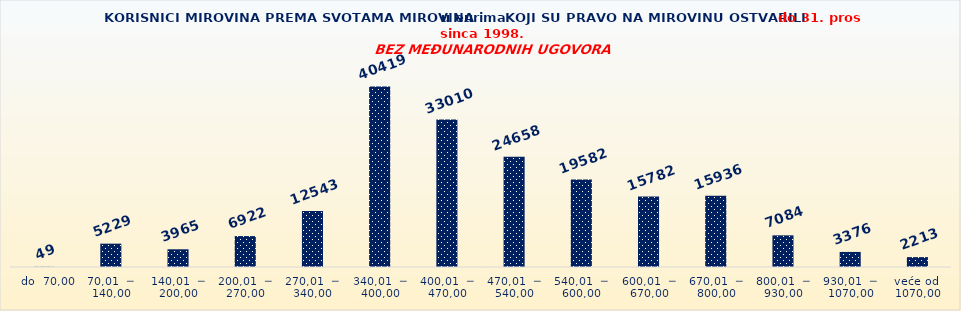
| Category | Series 0 |
|---|---|
|   do  70,00 | 49 |
| 70,01  ─  140,00 | 5229 |
| 140,01  ─  200,00 | 3965 |
| 200,01  ─  270,00 | 6922 |
| 270,01  ─  340,00 | 12543 |
| 340,01  ─  400,00 | 40419 |
| 400,01  ─  470,00 | 33010 |
| 470,01  ─  540,00 | 24658 |
| 540,01  ─  600,00 | 19582 |
| 600,01  ─  670,00 | 15782 |
| 670,01  ─  800,00 | 15936 |
| 800,01  ─  930,00 | 7084 |
| 930,01  ─  1070,00 | 3376 |
| veće od  1070,00 | 2213 |